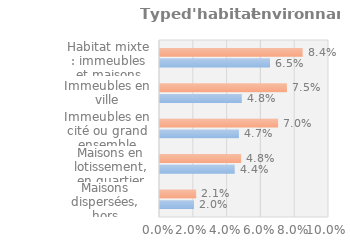
| Category | Series 0 | Series 1 |
|---|---|---|
| Maisons dispersées, hors agglomération | 0.02 | 0.021 |
| Maisons en lotissement, en quartier pavillonnaire | 0.044 | 0.048 |
| Immeubles en cité ou grand ensemble | 0.047 | 0.07 |
| Immeubles en ville | 0.048 | 0.075 |
| Habitat mixte : immeubles et maisons | 0.065 | 0.084 |